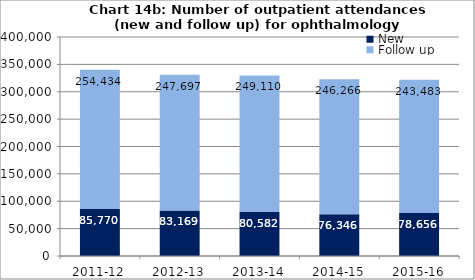
| Category | New | Follow up |
|---|---|---|
| 2011-12 | 85770 | 254434 |
| 2012-13 | 83169 | 247697 |
| 2013-14 | 80582 | 249110 |
| 2014-15 | 76346 | 246266 |
| 2015-16 | 78656 | 243483 |